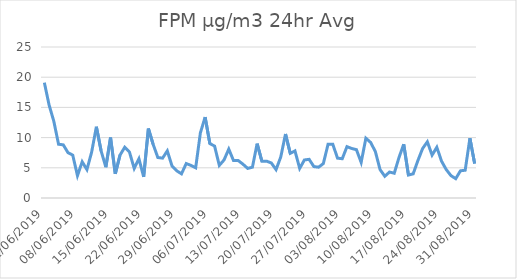
| Category | FPM |
|---|---|
| 01/06/2019 | 19.1 |
| 02/06/2019 | 15.4 |
| 03/06/2019 | 12.7 |
| 04/06/2019 | 8.9 |
| 05/06/2019 | 8.8 |
| 06/06/2019 | 7.5 |
| 07/06/2019 | 7.1 |
| 08/06/2019 | 3.7 |
| 09/06/2019 | 6 |
| 10/06/2019 | 4.7 |
| 11/06/2019 | 7.6 |
| 12/06/2019 | 11.8 |
| 13/06/2019 | 7.8 |
| 14/06/2019 | 5.1 |
| 15/06/2019 | 10 |
| 16/06/2019 | 4 |
| 17/06/2019 | 7.1 |
| 18/06/2019 | 8.4 |
| 19/06/2019 | 7.6 |
| 20/06/2019 | 4.9 |
| 21/06/2019 | 6.5 |
| 22/06/2019 | 3.5 |
| 23/06/2019 | 11.5 |
| 24/06/2019 | 8.9 |
| 25/06/2019 | 6.7 |
| 26/06/2019 | 6.6 |
| 27/06/2019 | 7.8 |
| 28/06/2019 | 5.3 |
| 29/06/2019 | 4.5 |
| 30/06/2019 | 4 |
| 01/07/2019 | 5.7 |
| 02/07/2019 | 5.4 |
| 03/07/2019 | 5 |
| 04/07/2019 | 10.8 |
| 05/07/2019 | 13.4 |
| 06/07/2019 | 9 |
| 07/07/2019 | 8.6 |
| 08/07/2019 | 5.4 |
| 09/07/2019 | 6.3 |
| 10/07/2019 | 8.1 |
| 11/07/2019 | 6.2 |
| 12/07/2019 | 6.2 |
| 13/07/2019 | 5.6 |
| 14/07/2019 | 4.9 |
| 15/07/2019 | 5.1 |
| 16/07/2019 | 9 |
| 17/07/2019 | 6.1 |
| 18/07/2019 | 6.1 |
| 19/07/2019 | 5.8 |
| 20/07/2019 | 4.7 |
| 21/07/2019 | 6.8 |
| 22/07/2019 | 10.6 |
| 23/07/2019 | 7.4 |
| 24/07/2019 | 7.8 |
| 25/07/2019 | 4.9 |
| 26/07/2019 | 6.3 |
| 27/07/2019 | 6.4 |
| 28/07/2019 | 5.2 |
| 29/07/2019 | 5.1 |
| 30/07/2019 | 5.7 |
| 31/07/2019 | 8.9 |
| 01/08/2019 | 8.9 |
| 02/08/2019 | 6.6 |
| 03/08/2019 | 6.5 |
| 04/08/2019 | 8.5 |
| 05/08/2019 | 8.2 |
| 06/08/2019 | 8 |
| 07/08/2019 | 5.9 |
| 08/08/2019 | 9.9 |
| 09/08/2019 | 9.2 |
| 10/08/2019 | 7.7 |
| 11/08/2019 | 4.7 |
| 12/08/2019 | 3.6 |
| 13/08/2019 | 4.3 |
| 14/08/2019 | 4.1 |
| 15/08/2019 | 6.7 |
| 16/08/2019 | 8.9 |
| 17/08/2019 | 3.8 |
| 18/08/2019 | 4 |
| 19/08/2019 | 6.2 |
| 20/08/2019 | 8.2 |
| 21/08/2019 | 9.3 |
| 22/08/2019 | 7.1 |
| 23/08/2019 | 8.4 |
| 24/08/2019 | 6.1 |
| 25/08/2019 | 4.7 |
| 26/08/2019 | 3.7 |
| 27/08/2019 | 3.2 |
| 28/08/2019 | 4.5 |
| 29/08/2019 | 4.6 |
| 30/08/2019 | 9.9 |
| 31/08/2019 | 5.7 |